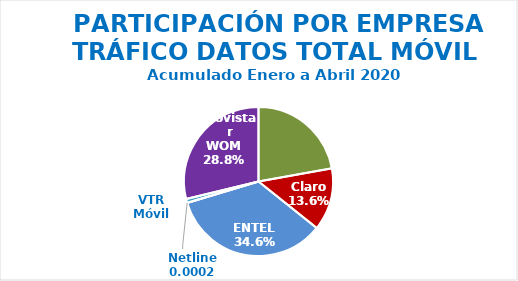
| Category | Series 0 |
|---|---|
| Movistar | 0.222 |
| Claro | 0.136 |
| ENTEL | 0.346 |
| Netline | 0 |
| VTR Móvil | 0.009 |
| WOM | 0.288 |